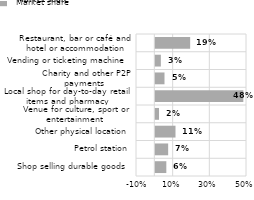
| Category | Market share |
|---|---|
| Shop selling durable goods  | 0.06 |
| Petrol station | 0.07 |
| Other physical location | 0.11 |
| Venue for culture, sport or entertainment  | 0.02 |
| Local shop for day-to-day retail items and pharmacy | 0.48 |
| Charity and other P2P payments  | 0.05 |
| Vending or ticketing machine  | 0.03 |
| Restaurant, bar or café and hotel or accommodation | 0.19 |